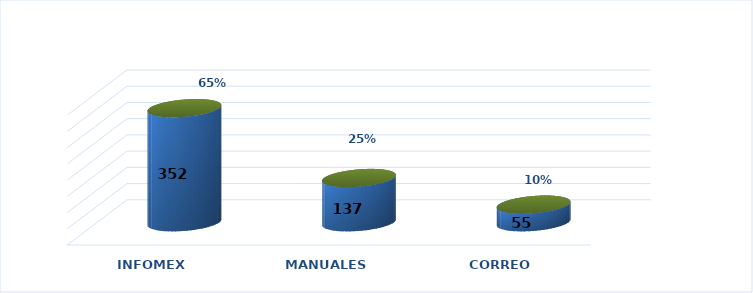
| Category | Series 0 | Series 1 |
|---|---|---|
| INFOMEX | 352 | 0.647 |
| MANUALES | 137 | 0.252 |
| CORREO | 55 | 0.101 |